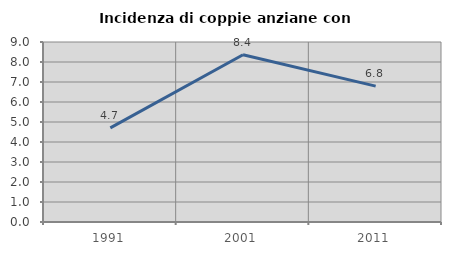
| Category | Incidenza di coppie anziane con figli |
|---|---|
| 1991.0 | 4.706 |
| 2001.0 | 8.361 |
| 2011.0 | 6.792 |